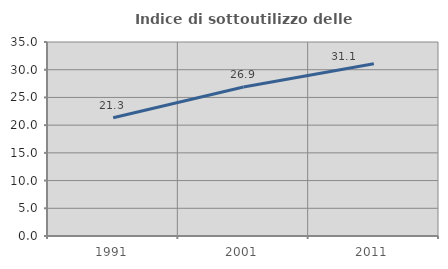
| Category | Indice di sottoutilizzo delle abitazioni  |
|---|---|
| 1991.0 | 21.328 |
| 2001.0 | 26.889 |
| 2011.0 | 31.092 |